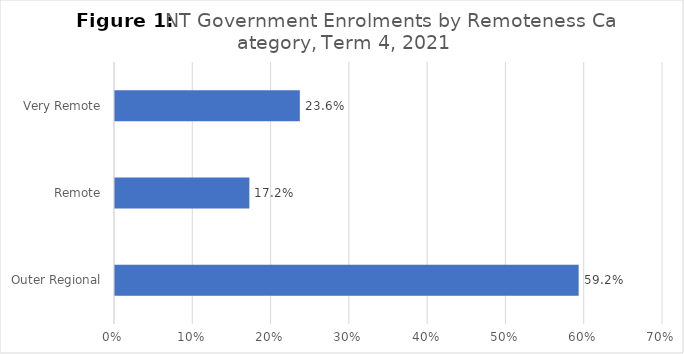
| Category | Series 0 |
|---|---|
| Outer Regional | 0.592 |
| Remote | 0.172 |
| Very Remote | 0.236 |